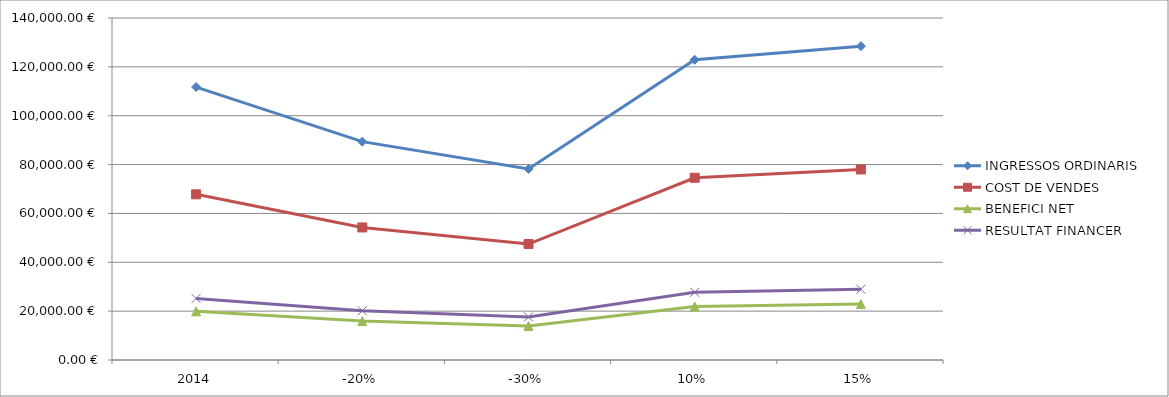
| Category | INGRESSOS ORDINARIS | COST DE VENDES | BENEFICI NET | RESULTAT FINANCER |
|---|---|---|---|---|
| 2014 | 111724.133 | 67824.715 | 19907.54 | 25199.418 |
| -20% | 89379.307 | 54259.772 | 15926.032 | 20159.534 |
| -30% | 78206.893 | 47477.301 | 13935.278 | 17639.592 |
| 10% | 122896.547 | 74607.187 | 21898.294 | 27719.359 |
| 15% | 128482.753 | 77998.423 | 22893.671 | 28979.33 |